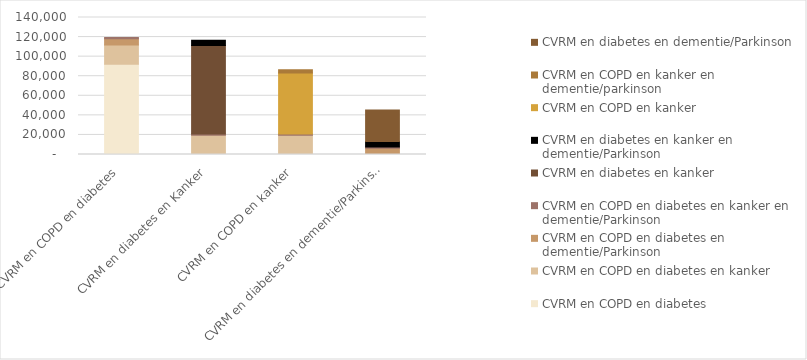
| Category | CVRM en COPD en diabetes | CVRM en COPD en diabetes en kanker | CVRM en COPD en diabetes en dementie/Parkinson | CVRM en COPD en diabetes en kanker en dementie/Parkinson | CVRM en diabetes en kanker | CVRM en diabetes en kanker en dementie/Parkinson | CVRM en COPD en kanker | CVRM en COPD en kanker en dementie/parkinson | CVRM en diabetes en dementie/Parkinson |
|---|---|---|---|---|---|---|---|---|---|
| CVRM en COPD en diabetes | 92181 | 19748 | 6456 | 1274 | 0 | 0 | 0 | 0 | 0 |
| CVRM en diabetes en Kanker | 0 | 19748 | 0 | 1274 | 90401 | 5433 | 0 | 0 | 0 |
| CVRM en COPD en kanker | 0 | 19748 | 0 | 1274 | 0 | 0 | 62236 | 3242 | 0 |
| CVRM en diabetes en dementie/Parkinson | 0 | 0 | 6456 | 1274 | 0 | 5433 | 0 | 0 | 32273 |